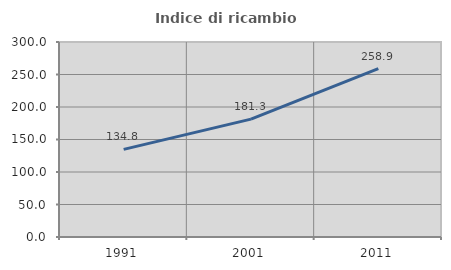
| Category | Indice di ricambio occupazionale  |
|---|---|
| 1991.0 | 134.783 |
| 2001.0 | 181.325 |
| 2011.0 | 258.94 |